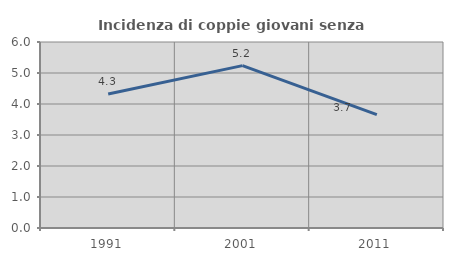
| Category | Incidenza di coppie giovani senza figli |
|---|---|
| 1991.0 | 4.321 |
| 2001.0 | 5.237 |
| 2011.0 | 3.66 |